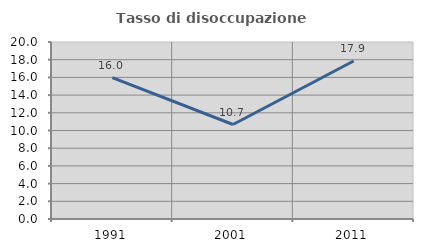
| Category | Tasso di disoccupazione giovanile  |
|---|---|
| 1991.0 | 15.978 |
| 2001.0 | 10.676 |
| 2011.0 | 17.857 |